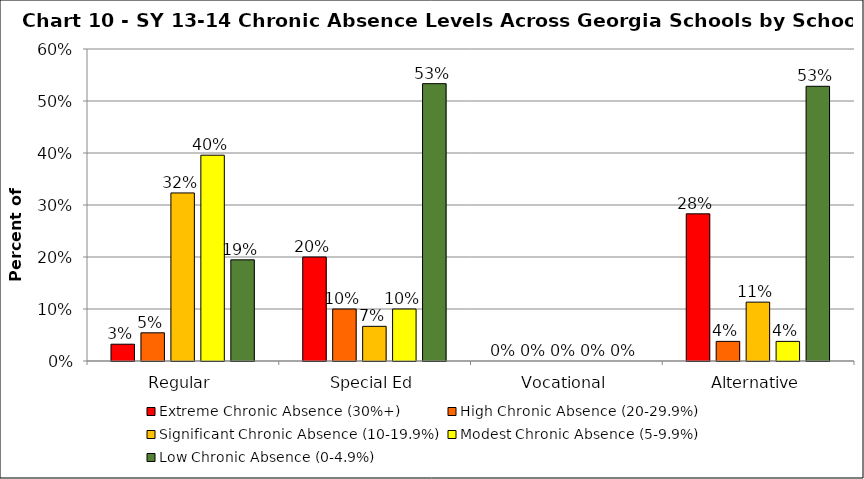
| Category | Extreme Chronic Absence (30%+) | High Chronic Absence (20-29.9%) | Significant Chronic Absence (10-19.9%) | Modest Chronic Absence (5-9.9%) | Low Chronic Absence (0-4.9%) |
|---|---|---|---|---|---|
| 0 | 0.032 | 0.054 | 0.323 | 0.396 | 0.195 |
| 1 | 0.2 | 0.1 | 0.067 | 0.1 | 0.533 |
| 2 | 0 | 0 | 0 | 0 | 0 |
| 3 | 0.283 | 0.038 | 0.113 | 0.038 | 0.528 |